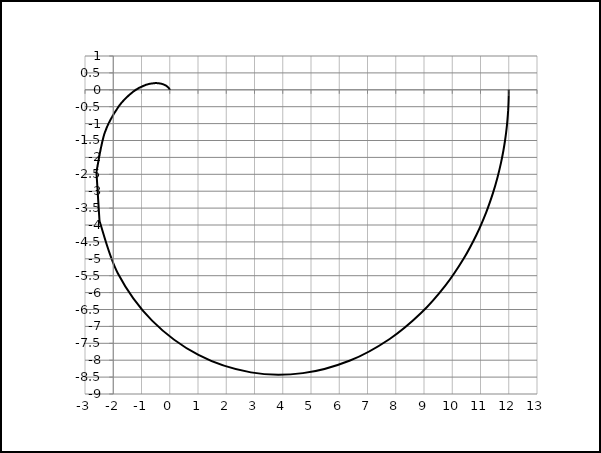
| Category | Series 0 |
|---|---|
| 12.0 | 0 |
| 12.0 | 0 |
| 12.0 | 0 |
| 12.0 | 0 |
| 12.0 | 0 |
| 12.0 | 0 |
| 12.0 | 0 |
| 12.0 | 0 |
| 12.0 | 0 |
| 12.0 | 0 |
| 12.0 | 0 |
| 12.0 | 0 |
| 12.0 | 0 |
| 12.0 | 0 |
| 12.0 | 0 |
| 12.0 | 0 |
| 12.0 | 0 |
| 12.0 | 0 |
| 12.0 | 0 |
| 12.0 | 0 |
| 12.0 | 0 |
| 12.0 | 0 |
| 12.0 | 0 |
| 12.0 | 0 |
| 12.0 | 0 |
| 12.0 | 0 |
| 12.0 | 0 |
| 12.0 | 0 |
| 12.0 | 0 |
| 12.0 | 0 |
| 12.0 | 0 |
| 12.0 | 0 |
| 12.0 | 0 |
| 12.0 | 0 |
| 12.0 | 0 |
| 12.0 | 0 |
| 12.0 | 0 |
| 12.0 | 0 |
| 12.0 | 0 |
| 12.0 | 0 |
| 12.0 | 0 |
| 12.0 | 0 |
| 12.0 | 0 |
| 12.0 | 0 |
| 12.0 | 0 |
| 12.0 | 0 |
| 12.0 | 0 |
| 12.0 | 0 |
| 12.0 | 0 |
| 12.0 | 0 |
| 12.0 | 0 |
| 12.0 | 0 |
| 12.0 | 0 |
| 12.0 | 0 |
| 12.0 | 0 |
| 12.0 | 0 |
| 12.0 | 0 |
| 12.0 | 0 |
| 12.0 | 0 |
| 12.0 | 0 |
| 12.0 | 0 |
| 12.0 | 0 |
| 12.0 | 0 |
| 12.0 | 0 |
| 12.0 | 0 |
| 12.0 | 0 |
| 12.0 | 0 |
| 12.0 | 0 |
| 12.0 | 0 |
| 12.0 | 0 |
| 12.0 | 0 |
| 12.0 | 0 |
| 12.0 | 0 |
| 12.0 | 0 |
| 12.0 | 0 |
| 12.0 | 0 |
| 12.0 | 0 |
| 12.0 | 0 |
| 12.0 | 0 |
| 12.0 | 0 |
| 12.0 | 0 |
| 12.0 | 0 |
| 12.0 | 0 |
| 12.0 | 0 |
| 12.0 | 0 |
| 12.0 | 0 |
| 12.0 | 0 |
| 12.0 | 0 |
| 12.0 | 0 |
| 12.0 | 0 |
| 12.0 | 0 |
| 12.0 | 0 |
| 12.0 | 0 |
| 12.0 | 0 |
| 12.0 | 0 |
| 12.0 | 0 |
| 12.0 | 0 |
| 12.0 | 0 |
| 12.0 | 0 |
| 12.0 | 0 |
| 12.0 | 0 |
| 12.0 | 0 |
| 12.0 | 0 |
| 12.0 | 0 |
| 12.0 | 0 |
| 12.0 | 0 |
| 12.0 | 0 |
| 12.0 | 0 |
| 12.0 | 0 |
| 12.0 | 0 |
| 12.0 | 0 |
| 12.0 | 0 |
| 12.0 | 0 |
| 12.0 | 0 |
| 12.0 | 0 |
| 12.0 | 0 |
| 12.0 | 0 |
| 12.0 | 0 |
| 12.0 | 0 |
| 12.0 | 0 |
| 12.0 | 0 |
| 12.0 | 0 |
| 12.0 | 0 |
| 12.0 | 0 |
| 12.0 | 0 |
| 12.0 | 0 |
| 12.0 | 0 |
| 12.0 | 0 |
| 12.0 | 0 |
| 12.0 | 0 |
| 12.0 | 0 |
| 12.0 | 0 |
| 12.0 | 0 |
| 12.0 | 0 |
| 12.0 | 0 |
| 12.0 | 0 |
| 12.0 | 0 |
| 12.0 | 0 |
| 12.0 | 0 |
| 12.0 | 0 |
| 12.0 | 0 |
| 12.0 | 0 |
| 12.0 | 0 |
| 12.0 | 0 |
| 12.0 | 0 |
| 12.0 | 0 |
| 12.0 | 0 |
| 12.0 | 0 |
| 12.0 | 0 |
| 12.0 | 0 |
| 12.0 | 0 |
| 12.0 | 0 |
| 12.0 | 0 |
| 12.0 | 0 |
| 12.0 | 0 |
| 12.0 | 0 |
| 12.0 | 0 |
| 12.0 | 0 |
| 12.0 | 0 |
| 12.0 | 0 |
| 12.0 | 0 |
| 12.0 | 0 |
| 12.0 | 0 |
| 12.0 | 0 |
| 12.0 | 0 |
| 12.0 | 0 |
| 12.0 | 0 |
| 12.0 | 0 |
| 12.0 | 0 |
| 12.0 | 0 |
| 12.0 | 0 |
| 12.0 | 0 |
| 12.0 | 0 |
| 12.0 | 0 |
| 12.0 | 0 |
| 12.0 | 0 |
| 12.0 | 0 |
| 12.0 | 0 |
| 12.0 | 0 |
| 12.0 | 0 |
| 12.0 | 0 |
| 12.0 | 0 |
| 12.0 | 0 |
| 12.0 | 0 |
| 12.0 | 0 |
| 12.0 | 0 |
| 12.0 | 0 |
| 12.0 | 0 |
| 12.0 | 0 |
| 12.0 | 0 |
| 12.0 | 0 |
| 12.0 | 0 |
| 12.0 | 0 |
| 12.0 | 0 |
| 12.0 | 0 |
| 12.0 | 0 |
| 12.0 | 0 |
| 12.0 | 0 |
| 12.0 | 0 |
| 12.0 | 0 |
| 12.0 | 0 |
| 12.0 | 0 |
| 12.0 | 0 |
| 12.0 | 0 |
| 12.0 | 0 |
| 12.0 | 0 |
| 12.0 | 0 |
| 12.0 | 0 |
| 12.0 | 0 |
| 12.0 | 0 |
| 12.0 | 0 |
| 12.0 | 0 |
| 12.0 | 0 |
| 12.0 | 0 |
| 12.0 | 0 |
| 12.0 | 0 |
| 12.0 | 0 |
| 12.0 | 0 |
| 12.0 | 0 |
| 12.0 | 0 |
| 12.0 | 0 |
| 12.0 | 0 |
| 12.0 | 0 |
| 12.0 | 0 |
| 12.0 | 0 |
| 12.0 | 0 |
| 12.0 | 0 |
| 12.0 | 0 |
| 12.0 | 0 |
| 12.0 | 0 |
| 12.0 | 0 |
| 12.0 | 0 |
| 12.0 | 0 |
| 12.0 | 0 |
| 12.0 | 0 |
| 12.0 | 0 |
| 12.0 | 0 |
| 12.0 | 0 |
| 12.0 | 0 |
| 12.0 | 0 |
| 12.0 | 0 |
| 12.0 | 0 |
| 12.0 | 0 |
| 12.0 | 0 |
| 12.0 | 0 |
| 12.0 | 0 |
| 12.0 | 0 |
| 12.0 | 0 |
| 12.0 | 0 |
| 12.0 | 0 |
| 12.0 | 0 |
| 12.0 | 0 |
| 12.0 | 0 |
| 12.0 | 0 |
| 12.0 | 0 |
| 12.0 | 0 |
| 12.0 | 0 |
| 12.0 | 0 |
| 12.0 | 0 |
| 12.0 | 0 |
| 12.0 | 0 |
| 12.0 | 0 |
| 12.0 | 0 |
| 12.0 | 0 |
| 12.0 | 0 |
| 12.0 | 0 |
| 12.0 | 0 |
| 12.0 | 0 |
| 12.0 | 0 |
| 12.0 | 0 |
| 12.0 | 0 |
| 12.0 | 0 |
| 12.0 | 0 |
| 12.0 | 0 |
| 12.0 | 0 |
| 12.0 | 0 |
| 12.0 | 0 |
| 12.0 | 0 |
| 12.0 | 0 |
| 12.0 | 0 |
| 12.0 | 0 |
| 12.0 | 0 |
| 12.0 | 0 |
| 12.0 | 0 |
| 12.0 | 0 |
| 12.0 | 0 |
| 12.0 | 0 |
| 12.0 | 0 |
| 12.0 | 0 |
| 12.0 | 0 |
| 12.0 | 0 |
| 12.0 | 0 |
| 12.0 | 0 |
| 12.0 | 0 |
| 12.0 | 0 |
| 12.0 | 0 |
| 12.0 | 0 |
| 12.0 | 0 |
| 12.0 | 0 |
| 12.0 | 0 |
| 12.0 | 0 |
| 12.0 | 0 |
| 12.0 | 0 |
| 12.0 | 0 |
| 12.0 | 0 |
| 12.0 | 0 |
| 12.0 | 0 |
| 12.0 | 0 |
| 12.0 | 0 |
| 12.0 | 0 |
| 12.0 | 0 |
| 12.0 | 0 |
| 12.0 | 0 |
| 12.0 | 0 |
| 12.0 | 0 |
| 12.0 | 0 |
| 12.0 | 0 |
| 12.0 | 0 |
| 12.0 | 0 |
| 12.0 | 0 |
| 12.0 | 0 |
| 12.0 | 0 |
| 12.0 | 0 |
| 12.0 | 0 |
| 12.0 | 0 |
| 12.0 | 0 |
| 12.0 | 0 |
| 12.0 | 0 |
| 12.0 | 0 |
| 12.0 | 0 |
| 12.0 | 0 |
| 12.0 | 0 |
| 12.0 | 0 |
| 12.0 | 0 |
| 12.0 | 0 |
| 12.0 | 0 |
| 12.0 | 0 |
| 12.0 | 0 |
| 12.0 | 0 |
| 12.0 | 0 |
| 12.0 | 0 |
| 12.0 | 0 |
| 12.0 | 0 |
| 12.0 | 0 |
| 12.0 | 0 |
| 12.0 | 0 |
| 12.0 | 0 |
| 12.0 | 0 |
| 12.0 | 0 |
| 12.0 | 0 |
| 12.0 | 0 |
| 12.0 | 0 |
| 12.0 | 0 |
| 12.0 | 0 |
| 12.0 | 0 |
| 12.0 | 0 |
| 12.0 | 0 |
| 12.0 | 0 |
| 12.0 | 0 |
| 12.0 | 0 |
| 12.0 | 0 |
| 12.0 | 0 |
| 12.0 | 0 |
| 12.0 | 0 |
| 12.0 | 0 |
| 12.0 | 0 |
| 12.0 | 0 |
| 12.0 | 0 |
| 12.0 | 0 |
| 12.0 | 0 |
| 12.0 | 0 |
| 12.0 | 0 |
| 12.0 | 0 |
| 12.0 | 0 |
| 12.0 | 0 |
| 12.0 | 0 |
| 12.0 | 0 |
| 12.0 | 0 |
| 12.0 | 0 |
| 12.0 | 0 |
| 12.0 | 0 |
| 12.0 | 0 |
| 12.0 | 0 |
| 12.0 | 0 |
| 12.0 | 0 |
| 12.0 | 0 |
| 12.0 | 0 |
| 12.0 | 0 |
| 12.0 | 0 |
| 12.0 | 0 |
| 12.0 | 0 |
| 12.0 | 0 |
| 12.0 | 0 |
| 12.0 | 0 |
| 12.0 | 0 |
| 12.0 | 0 |
| 11.999999999999998 | 0 |
| 11.999999999999998 | 0 |
| 11.999999999999998 | 0 |
| 11.999999999999993 | 0 |
| 11.999999999999993 | 0 |
| 11.999999999999991 | 0 |
| 11.999999999999986 | 0 |
| 11.99999999999998 | 0 |
| 11.999999999999972 | 0 |
| 11.999999999999957 | 0 |
| 11.99999999999994 | 0 |
| 11.999999999999915 | 0 |
| 11.999999999999876 | 0 |
| 11.99999999999982 | 0 |
| 11.999999999999748 | 0 |
| 11.99999999999963 | 0 |
| 11.999999999999474 | 0 |
| 11.99999999999924 | 0 |
| 11.999999999998906 | 0 |
| 11.999999999998423 | 0 |
| 11.99999999999773 | 0 |
| 11.999999999996732 | 0 |
| 11.99999999999529 | 0 |
| 11.999999999993221 | 0 |
| 11.999999999990244 | 0 |
| 11.999999999985945 | 0 |
| 11.999999999979764 | 0 |
| 11.999999999970862 | 0 |
| 11.999999999958039 | 0 |
| 11.99999999993958 | 0 |
| 11.999999999912998 | 0 |
| 11.999999999874714 | 0 |
| 11.99999999981959 | 0 |
| 11.999999999740206 | 0 |
| 11.999999999625897 | 0 |
| 11.999999999461291 | 0 |
| 11.999999999224258 | 0 |
| 11.999999998882931 | 0 |
| 11.99999999839142 | 0 |
| 11.999999997683643 | 0 |
| 11.999999996664448 | 0 |
| 11.999999995196804 | 0 |
| 11.9999999930834 | 0 |
| 11.999999990040097 | 0 |
| 11.999999985657736 | 0 |
| 11.999999979347136 | -0.001 |
| 11.999999970259877 | -0.001 |
| 11.999999957174222 | -0.001 |
| 11.99999993833088 | -0.001 |
| 11.999999911196467 | -0.001 |
| 11.999999872122912 | -0.001 |
| 11.999999815856997 | -0.002 |
| 11.999999734834077 | -0.002 |
| 11.999999618161075 | -0.003 |
| 11.999999450151948 | -0.003 |
| 11.999999208218817 | -0.004 |
| 11.999998859835111 | -0.004 |
| 11.999998358162594 | -0.005 |
| 11.999997635754207 | -0.006 |
| 11.999996595486202 | -0.008 |
| 11.999995097500426 | -0.009 |
| 11.999992940401226 | -0.011 |
| 11.999989834179026 | -0.013 |
| 11.999985361220427 | -0.016 |
| 11.999978920162865 | -0.019 |
| 11.999969645045828 | -0.023 |
| 11.999956288889424 | -0.027 |
| 11.99993705604935 | -0.033 |
| 11.999909360811813 | -0.04 |
| 11.999869479777917 | -0.047 |
| 11.999812051313386 | -0.057 |
| 11.999729354789531 | -0.068 |
| 11.999610272759533 | -0.082 |
| 11.999438796635987 | -0.098 |
| 11.999191875164499 | -0.118 |
| 11.998836316843327 | -0.142 |
| 11.998324330688524 | -0.17 |
| 11.997587107591105 | -0.204 |
| 11.996525582976538 | -0.245 |
| 11.99499714644642 | -0.294 |
| 11.992796527315983 | -0.353 |
| 11.989628318805345 | -0.423 |
| 11.985067514424639 | -0.508 |
| 11.978502890667428 | -0.609 |
| 11.969055913345096 | -0.731 |
| 11.95546486281193 | -0.876 |
| 11.935919833469299 | -1.05 |
| 11.907828966610708 | -1.259 |
| 11.867489710746833 | -1.507 |
| 11.809631596613693 | -1.803 |
| 11.726790781418146 | -2.155 |
| 11.608476065818245 | -2.57 |
| 11.440101409506955 | -3.058 |
| 11.201711633810902 | -3.624 |
| 10.866653247428502 | -4.272 |
| 10.40060022286531 | -4.999 |
| 9.761806713671872 | -5.786 |
| 8.904152028534533 | -6.598 |
| 7.785282653859226 | -7.372 |
| 6.382223784531763 | -8.008 |
| 4.7146896318694465 | -8.382 |
| 2.870181464732313 | -8.36 |
| 1.0155843359855268 | -7.845 |
| -0.6250640394099964 | -6.829 |
| -1.8348128370071894 | -5.432 |
| -2.4866667667833133 | -3.881 |
| -2.595630107269849 | -2.432 |
| -2.3034767290612987 | -1.276 |
| -1.8077441365145859 | -0.493 |
| -1.2832223711025101 | -0.048 |
| -0.8376757933500107 | 0.149 |
| -0.5100217358054893 | 0.198 |
| -0.29335151216438027 | 0.178 |
| -0.1612505125945401 | 0.136 |
| -0.0855737335932809 | 0.095 |
| -0.044220088320146955 | 0.062 |
| -0.022404336567744647 | 0.039 |
| -0.011189320144033652 | 0.024 |
| -0.0055308041578830515 | 0.015 |
| -0.0027138038250681426 | 0.009 |
| -0.001324679478616649 | 0.005 |
| -0.0006442517757531034 | 0.003 |
| -0.0003125275567830127 | 0.002 |
| -0.00015133659969691072 | 0.001 |
| -7.319100535948118e-05 | 0.001 |
| -3.536665654835723e-05 | 0 |
| -1.7079204451634723e-05 | 0 |
| -8.244391459262932e-06 | 0 |
| -3.978529606768549e-06 | 0 |
| -1.919545202188114e-06 | 0 |
| -9.260038346703131e-07 | 0 |
| -4.466677919521273e-07 | 0 |
| -2.154402814582366e-07 | 0 |
| -1.0390791513834795e-07 | 0 |
| -5.011365559847217e-08 | 0 |
| -2.4168718666285562e-08 | 0 |
| -1.1655859021533973e-08 | 0 |
| -5.621214601354576e-09 | 0 |
| -2.710895183559112e-09 | 0 |
| -1.3073533408072313e-09 | 0 |
| -6.304804655954504e-10 | 0 |
| -3.0405291939403957e-10 | 0 |
| -1.4663105122928253e-10 | 0 |
| -7.071347542042786e-11 | 0 |
| -3.4101858217009784e-11 | 0 |
| -1.6445748629832033e-11 | 0 |
| -7.9310204873927e-12 | 0 |
| -3.824761604223996e-12 | 0 |
| -1.8445039242692565e-12 | 0 |
| -8.895179903042611e-13 | 0 |
| -4.289728899921481e-13 | 0 |
| -2.0687353158313692e-13 | 0 |
| -9.976540961831859e-14 | 0 |
| -4.811218022741476e-14 | 0 |
| -2.320224858824672e-14 | 0 |
| -1.1189356388469551e-14 | 0 |
| -5.39610178564433e-15 | 0 |
| -2.6022867850538194e-15 | 0 |
| -1.254960848674742e-15 | 0 |
| -6.05208747576956e-16 | 0 |
| -2.9186378811086266e-16 | 0 |
| -1.4075221318777473e-16 | 0 |
| -6.787818941680402e-17 | 0 |
| -3.273446640932648e-17 | 0 |
| -1.5786297479128572e-17 | 0 |
| -7.61299068945858e-18 | 0 |
| -3.671388259223364e-18 | 0 |
| -1.7705383202417575e-18 | 0 |
| -8.538475698242774e-19 | 0 |
| -4.117706259679239e-19 | 0 |
| -1.9857765529954965e-19 | 0 |
| -9.576468717209342e-20 | 0 |
| -4.618281596207556e-20 | 0 |
| -2.2271805538375362e-20 | 0 |
| -1.0740646961393472e-20 | 0 |
| -5.179710147401321e-21 | 0 |
| -2.4979312053856556e-21 | 0 |
| -1.2046350334753968e-21 | 0 |
| -5.809389629075446e-22 | 0 |
| -2.801596078852184e-22 | 0 |
| -1.3510783559331837e-22 | 0 |
| -6.515617071454583e-23 | 0 |
| -3.1421764426440824e-23 | 0 |
| -1.5153242875425178e-23 | 0 |
| -7.30769814594852e-24 | 0 |
| -3.524159985509788e-24 | 0 |
| -1.6995370300498277e-24 | 0 |
| -8.196069782264378e-25 | 0 |
| -3.952579949009498e-25 | 0 |
| -1.906143879730938e-25 | 0 |
| -9.192437691604609e-26 | 0 |
| -4.433081448497904e-26 | 0 |
| -2.1378672108883686e-26 | 0 |
| -1.0309930608065401e-26 | 0 |
| -4.971995856513137e-27 | 0 |
| -2.3977603474697227e-27 | 0 |
| -1.156327328062187e-27 | 0 |
| -5.576424228695008e-28 | 0 |
| -2.6892477954740727e-28 | 0 |
| -1.2968980495148934e-28 | 0 |
| -6.254330871503168e-29 | 0 |
| -3.016170366272753e-29 | 0 |
| -1.454557468302834e-29 | 0 |
| -7.014648284639448e-30 | 0 |
| -3.382835785416403e-30 | 0 |
| -1.6313829983682514e-30 | 0 |
| -7.867394860958005e-31 | 0 |
| -3.7940754537799035e-31 | 0 |
| -1.8297045976947837e-31 | 0 |
| -8.823806894747227e-32 | 0 |
| -4.255308108963747e-32 | 0 |
| -2.0521354692147715e-32 | 0 |
| -9.896486637802713e-33 | 0 |
| -4.772611225792204e-33 | 0 |
| -2.3016064939198526e-33 | 0 |
| -1.1099568354165954e-33 | 0 |
| -5.352801096723555e-34 | 0 |
| -2.5814048498859742e-34 | 0 |
| -1.2448904561564307e-34 | 0 |
| -6.00352264735933e-35 | 0 |
| -2.8952173260799247e-35 | 0 |
| -1.396227491357989e-35 | 0 |
| -6.733350170514993e-36 | 0 |
| -3.2471789016758255e-36 | 0 |
| -1.565962047490271e-36 | 0 |
| -7.55190030618379e-37 | 0 |
| -3.6419272309914112e-37 | 0 |
| -1.7563306476617536e-37 | 0 |
| -8.469958756084847e-38 | 0 |
| -4.0846637519699305e-38 | 0 |
| -1.969841701374388e-38 | 0 |
| -9.499622402461365e-39 | 0 |
| -4.5812222234092236e-39 | 0 |
| -2.209308556813861e-39 | 0 |
| -1.0654458703770551e-39 | 0 |
| -5.138145594025153e-40 | 0 |
| -2.477886571192685e-40 | 0 |
| -1.194968446755732e-40 | 0 |
| -5.762772216221702e-41 | 0 |
| -2.7791146876069157e-41 | 0 |
| -1.3402366356129035e-41 | 0 |
| -6.463332540571486e-42 | 0 |
| -3.116962066247823e-42 | 0 |
| -1.5031645767013045e-42 | 0 |
| -7.249057565110459e-43 | 0 |
| -3.4958803844089796e-43 | 0 |
| -1.6858991051355035e-43 | 0 |
| -8.130300468438966e-44 | 0 |
| -3.920862494424657e-44 | 0 |
| -1.890848039363743e-44 | 0 |
| -9.118673029339037e-45 | 0 |
| -4.39750821245131e-45 | 0 |
| -2.1207119080108562e-45 | 0 |
| -1.0227198630453586e-45 | 0 |
| -4.932098104964117e-46 | 0 |
| -2.3785195336439607e-46 | 0 |
| -1.1470483862094723e-46 | 0 |
| -5.53167624522315e-47 | 0 |
| -2.6676679423336963e-47 | 0 |
| -1.286491098733457e-47 | 0 |
| -6.204143030157489e-48 | 0 |
| -2.9919671248830483e-48 | 0 |
| -1.4428853804412855e-48 | 0 |
| -6.958359280677492e-49 | 0 |
| -3.3556902395242547e-49 | 0 |
| -1.6182919750792126e-49 | 0 |
| -7.804262997102687e-50 | 0 |
| -3.7636299175842426e-50 | 0 |
| -1.8150221438967224e-50 | 0 |
| -8.753000308143914e-51 | 0 |
| -4.221161414035454e-51 | 0 |
| -2.0356681201945668e-51 | 0 |
| -9.81707233890127e-52 | 0 |
| -4.7343134350411215e-52 | 0 |
| -2.283137266127085e-52 | 0 |
| -1.1010499933097443e-52 | 0 |
| -5.309847575760727e-53 | 0 |
| -2.560690381829055e-53 | 0 |
| -1.2349008400024376e-53 | 0 |
| -5.955347415135213e-54 | 0 |
| -2.8719846716508554e-54 | 0 |
| -1.385023472053846e-54 | 0 |
| -6.6793184416177e-55 | 0 |
| -3.221121933650512e-55 | 0 |
| -1.5533959942373227e-55 | 0 |
| -7.491300126530297e-56 | 0 |
| -3.6127026073159206e-56 | 0 |
| -1.742236982694793e-56 | 0 |
| -8.401991621792017e-57 | 0 |
| -4.051886391682108e-57 | 0 |
| -1.9540347182108935e-57 | 0 |
| -9.423392738285558e-58 | 0 |
| -4.544460232583699e-58 | 0 |
| -2.1915799732753177e-58 | 0 |
| -1.0568962062477423e-58 | 0 |
| -5.096914574883018e-59 | 0 |
| -2.458002784955159e-59 | 0 |
| -1.1853794294729742e-59 | 0 |
| -5.716528884418282e-60 | 0 |
| -2.756813698118384e-60 | 0 |
| -1.3294819146018446e-60 | 0 |
| -6.411467566559821e-61 | 0 |
| -3.0919500224536184e-61 | 0 |
| -1.4911024413838823e-61 | 0 |
| -7.190887545254067e-62 | 0 |
| -3.467827712796134e-62 | 0 |
| -1.6723706176678898e-62 | 0 |
| -8.065058920080488e-63 | 0 |
| -3.8893995563659766e-63 | 0 |
| -1.875674940377111e-63 | 0 |
| -9.045500291170483e-64 | 0 |
| -4.362220433627742e-64 | 0 |
| -2.1036942677602933e-64 | 0 |
| -1.0145130535109435e-64 | 0 |
| -4.892520512687808e-65 | 0 |
| -2.3594331176156493e-65 | 0 |
| -1.1378439031711275e-65 | 0 |
| -5.487287341681751e-66 | 0 |
| -2.646261256598066e-66 | 0 |
| -1.2761676584674318e-66 | 0 |
| -6.154357920849887e-67 | 0 |
| -2.967958102261713e-67 | 0 |
| -1.4313069551802241e-67 | 0 |
| -6.902521967497224e-68 | 0 |
| -3.328762522905684e-68 | 0 |
| -1.6053060006296703e-68 | 0 |
| -7.741637734518089e-69 | 0 |
| -3.733428691414974e-69 | 0 |
| -1.800457509362932e-69 | 0 |
| -8.682761908578957e-70 | 0 |
| -4.187288729060067e-70 | 0 |
| -2.0193329133198634e-70 | 0 |
| -9.73829529957496e-71 | 0 |
| -4.696322964686998e-71 | 0 |
| -2.264816244544271e-71 | 0 |
| -1.0922146241050688e-71 | 0 |
| -5.267238735074598e-72 | 0 |
| -2.540142136899402e-72 | 0 |
| -1.2249913854646036e-72 | 0 |
| -5.907558764779147e-73 | 0 |
| -2.848938447520809e-73 | 0 |
| -1.3739093593368095e-73 | 0 |
| -6.625720290011624e-74 | 0 |
| -3.195274059612088e-74 | 0 |
| -1.540930777204904e-74 | 0 |
| -7.431186232662541e-75 | 0 |
| -3.5837124964614876e-75 | 0 |
| -1.728256412259591e-75 | 0 |
| -8.334569889369167e-76 | 0 |
| -4.019372053129421e-76 | 0 |
| -1.9383545780909642e-76 | 0 |
| -9.347774778602256e-77 | 0 |
| -4.5079932381376614e-77 | 0 |
| -2.1739936526512654e-77 | 0 |
| -1.0484151488480257e-77 | 0 |
| -5.056014413811852e-78 | 0 |
| -2.438278556043525e-78 | 0 |
| -1.1758673592030894e-78 | 0 |
| -5.67065663195934e-79 | 0 |
| -2.734691662789033e-79 | 0 |
| -1.3188134947863783e-79 | 0 |
| -6.360018782727521e-80 | 0 |
| -3.0671386876579488e-80 | 0 |
| -1.479137098600477e-80 | 0 |
| -7.133184310380385e-81 | 0 |
| -3.440000149681901e-81 | 0 |
| -1.6589506894685091e-81 | 0 |
| -8.000340902143661e-82 | 0 |
| -3.8581890924689706e-82 | 0 |
| -1.8606235978341866e-82 | 0 |
| -8.972914727209624e-83 | 0 |
| -4.327215821378097e-83 | 0 |
| -2.0868131854639748e-83 | 0 |
| -1.006372099471439e-83 | 0 |
| -4.853260510568282e-84 | 0 |
| -2.340499860420662e-84 | 0 |
| -1.128713281452865e-84 | 0 |
| -5.443254636636116e-85 | 0 |
| -2.625026348686399e-85 | 0 |
| -1.2659270585871908e-85 | 0 |
| -6.104972311859525e-86 | 0 |
| -2.944141739901391e-86 | 0 |
| -1.4198214409246676e-86 | 0 |
| -6.8471327205086235e-87 | 0 |
| -3.3020508875909652e-87 | 0 |
| -1.5924242320558285e-87 | 0 |
| -7.679515007985285e-88 | 0 |
| -3.70346981480772e-88 | 0 |
| -1.7860097486534146e-88 | 0 |
| -8.613087136638767e-89 | 0 |
| -4.1536878552463185e-89 | 0 |
| -2.0031287882167812e-89 | 0 |
| -9.660150406138032e-90 | 0 |
| -4.658637348639098e-90 | 0 |
| -2.24664223989154e-90 | 0 |
| -1.083450154268683e-90 | 0 |
| -5.224971808780298e-91 | 0 |
| -2.5197587812405006e-91 | 0 |
| -1.2151614492865065e-91 | 0 |
| -5.860153594167184e-92 | 0 |
| -2.826077157680934e-92 | 0 |
| -1.3628844317519935e-92 | 0 |
| -6.572552236458298e-93 | 0 |
| -3.169633601687066e-93 | 0 |
| -1.5285655872333464e-93 | 0 |
| -7.371554722383036e-94 | 0 |
| -3.554955016581327e-94 | 0 |
| -1.7143880288297295e-94 | 0 |
| -8.267689182242138e-95 | 0 |
| -3.987118625695477e-95 | 0 |
| -1.9228002631633273e-95 | 0 |
| -9.272763614792282e-96 | 0 |
| -4.471818872874364e-96 | 0 |
| -2.1565484533537644e-96 | 0 |
| -1.0400021476435976e-96 | 0 |
| -5.015442455842969e-97 | 0 |
| -2.418712604090938e-97 | 0 |
| -1.1664316184852137e-97 | 0 |
| -5.6251524811208246e-98 | 0 |
| -2.7127471456022498e-98 | 0 |
| -1.3082306836430603e-98 | 0 |
| -6.308982849358893e-99 | 0 |
| -3.042526451272615e-99 | 0 |
| -1.4672677716399574e-99 | 0 |
| -7.075944114776029e-100 | 0 |
| -3.4123958886844286e-100 | 0 |
| -1.6456384494041429e-100 | 0 |
| -7.936142213561647e-101 | 0 |
| -3.827229076756196e-101 | 0 |
| -1.8456930347010978e-101 | 0 |
| -8.90091162568045e-102 | 0 |
| -4.292492103433858e-102 | 0 |
| -2.0700675653133966e-102 | 0 |
| -9.982964724698094e-103 | 0 |
| -4.814315550105177e-103 | 0 |
| -2.3217185330368324e-103 | 0 |
| -1.1196559283549542e-103 | 0 |
| -5.399575271773508e-104 | 0 |
| -2.6039618401685523e-104 | 0 |
| -1.2557686343405439e-104 | 0 |
| -6.055982997398458e-105 | 0 |
| -2.9205164918009542e-105 | 0 |
| -1.4084280921107996e-105 | 0 |
| -6.792187944207176e-106 | 0 |
| -3.275553599636949e-106 | 0 |
| -1.5796458331582505e-106 | 0 |
| -7.617890784906686e-107 | 0 |
| -3.673751343029846e-107 | 0 |
| -1.771677923914856e-107 | 0 |
| -8.5439714694968e-108 | 0 |
| -4.120356611447145e-108 | 0 |
| -1.9870546930204215e-108 | 0 |
| -9.582632585939536e-109 | 0 |
| -4.62125414059584e-109 | 0 |
| -2.228614072432407e-109 | 0 |
| -1.074756014869024e-109 | 0 |
| -5.1830440531878085e-110 | 0 |
| -2.499538991699369e-110 | 0 |
| -1.2054103933735384e-110 | 0 |
| -5.813128826068377e-111 | 0 |
| -2.8033993181271117e-111 | 0 |
| -1.3519479736338301e-111 | 0 |
| -6.519810829638459e-112 | 0 |
| -3.144198895466077e-112 | 0 |
| -1.5162996216560946e-112 | 0 |
| -7.312401724807556e-113 | 0 |
| -3.526428300929571e-113 | 0 |
| -1.7006309321612516e-113 | 0 |
| -8.201345158956658e-114 | 0 |
| -3.95512401570055e-114 | 0 |
| -1.9073707637444784e-114 | 0 |
| -9.19835437762576e-115 | 0 |
| -4.435934788592671e-115 | 0 |
| -2.13924324295557e-115 | 0 |
| -1.0316566565179256e-115 | 0 |
| -4.975196067312528e-116 | 0 |
| -2.3993036590048854e-116 | 0 |
| -1.1570715948133132e-116 | 0 |
| -5.5800134780734615e-117 | 0 |
| -2.6909787220647486e-117 | 0 |
| -1.2977327942056081e-117 | 0 |
| -6.258356453537846e-118 | 0 |
| -3.0181117156336067e-118 | 0 |
| -1.4554936900239229e-118 | 0 |
| -7.019163242785119e-119 | 0 |
| -3.385013137917208e-119 | 0 |
| -1.6324330333319868e-119 | 0 |
| -7.872458686979108e-120 | 0 |
| -3.796517499507673e-120 | 0 |
| -1.830882281784179e-120 | 0 |
| -8.829486312616606e-121 | 0 |
| -4.258047025760323e-121 | 0 |
| -2.053456320293366e-121 | 0 |
| -9.90285648289625e-122 | 0 |
| -4.775683103248577e-122 | 0 |
| -2.30308791630429e-122 | 0 |
| -1.1106712559337817e-122 | 0 |
| -5.3562464117176985e-123 | 0 |
| -2.5830663636755875e-123 | 0 |
| -1.2456917263096005e-123 | 0 |
| -6.00738679740355e-124 | 0 |
| -2.897080824365139e-124 | 0 |
| -1.397126169157571e-124 | 0 |
| -6.737684071940448e-125 | 0 |
| -3.249268939014491e-125 | 0 |
| -1.5669699744475747e-125 | 0 |
| -7.556761065044242e-126 | 0 |
| -3.644271346954205e-126 | 0 |
| -1.7574611048197367e-126 | 0 |
| -8.475410420619877e-127 | 0 |
| -4.087292834018071e-127 | 0 |
| -1.9711095843065555e-127 | 0 |
| -9.50573680703393e-128 | 0 |
| -4.58417091388596e-128 | 0 |
| -2.2107305718971642e-128 | 0 |
| -1.0661316415399137e-128 | 0 |
| -5.1414527466238134e-129 | 0 |
| -2.4794814557406503e-129 | 0 |
| -1.1957375847514713e-129 | 0 |
| -5.766481407944984e-130 | 0 |
| -2.7809034567635912e-130 | 0 |
| -1.3410992750596028e-130 | 0 |
| -6.467492645927867e-131 | 0 |
| -3.118968289895769e-131 | 0 |
| -1.5041320842475742e-131 | 0 |
| -7.253723400113687e-132 | 0 |
| -3.498130497740011e-132 | 0 |
| -1.6869842292341873e-132 | 0 |
| -8.135533512896355e-133 | 0 |
| -3.9233861462656025e-133 | 0 |
| -1.892065078253088e-133 | 0 |
| -9.124542236945837e-134 | 0 |
| -4.4003386559345293e-134 | 0 |
| -2.1220768981165745e-134 | 0 |
| -1.0233781337367739e-134 | 0 |
| -4.935272635690463e-135 | 0 |
| -2.3800504608846738e-135 | 0 |
| -1.1477866805963903e-135 | 0 |
| -5.5352366926909244e-136 | 0 |
| -2.669384979114064e-136 | 0 |
| -1.2873191450202854e-136 | 0 |
| -6.208136308932704e-137 | 0 |
| -2.993892895897333e-137 | 0 |
| -1.4438140894566617e-137 | 0 |
| -6.962838008568004e-138 | 0 |
| -3.3578501198726875e-138 | 0 |
| -1.6193335840435413e-138 | 0 |
| -7.809286188481587e-139 | 0 |
| -3.7660523671303936e-139 | 0 |
| -1.816190377667049e-139 | 0 |
| -8.758634151557916e-140 | 0 |
| -4.223878352410259e-140 | 0 |
| -2.0369783721114289e-140 | 0 |
| -9.82339106921021e-141 | 0 |
| -4.737360662234865e-141 | 0 |
| -2.2846068008462886e-141 | 0 |
| -1.101758680963681e-141 | 0 |
| -5.3132652438449105e-142 | 0 |
| -2.5623385628110106e-142 | 0 |
| -1.2356956803679648e-142 | 0 |
| -5.959180557330077e-143 | 0 |
| -2.8738332163050144e-143 | 0 |
| -1.3859149384186998e-143 | 0 |
| -6.683617565676595e-144 | 0 |
| -3.2231951994968167e-144 | 0 |
| -1.5543958330906712e-144 | 0 |
| -7.496121880259797e-145 | 0 |
| -3.615027912933931e-145 | 0 |
| -1.7433583685059467e-145 | 0 |
| -8.407399539476986e-146 | 0 |
| -4.054494376676785e-146 | 0 |
| -1.9552924270239134e-146 | 0 |
| -9.429458077854519e-147 | 0 |
| -4.547385261311016e-147 | 0 |
| -2.192990577406933e-147 | 0 |
| -1.05757647444393e-147 | 0 |
| -5.1001951892550614e-148 | 0 |
| -2.4595848713614293e-148 | 0 |
| -1.1861423955253806e-148 | 0 |
| -5.720208311754345e-149 | 0 |
| -2.758588113307459e-149 | 0 |
| -1.3303376318033657e-149 | 0 |
| -6.415594289175183e-150 | 0 |
| -3.093940147171675e-150 | 0 |
| -1.4920621851715257e-150 | 0 |
| -7.195515939291691e-151 | 0 |
| -3.470059770105948e-151 | 0 |
| -1.673447034194613e-151 | 0 |
| -8.07024997200334e-152 | 0 |
| -3.891902957177539e-152 | 0 |
| -1.8768822131450327e-152 | 0 |
| -9.05132240135529e-153 | 0 |
| -4.3650281642338405e-153 | 0 |
| -2.1050483045109197e-153 | 0 |
| -1.0151660419130591e-153 | 0 |
| -4.8956695694109705e-154 | 0 |
| -2.3609517599397038e-154 | 0 |
| -1.1385762731190704e-154 | 0 |
| -5.490819218359713e-155 | 0 |
| -2.6479645150268688e-155 | 0 |
| -1.2769890601016928e-155 | 0 |